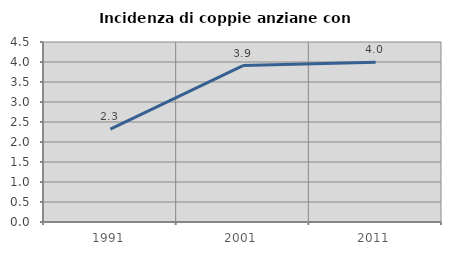
| Category | Incidenza di coppie anziane con figli |
|---|---|
| 1991.0 | 2.322 |
| 2001.0 | 3.911 |
| 2011.0 | 3.991 |